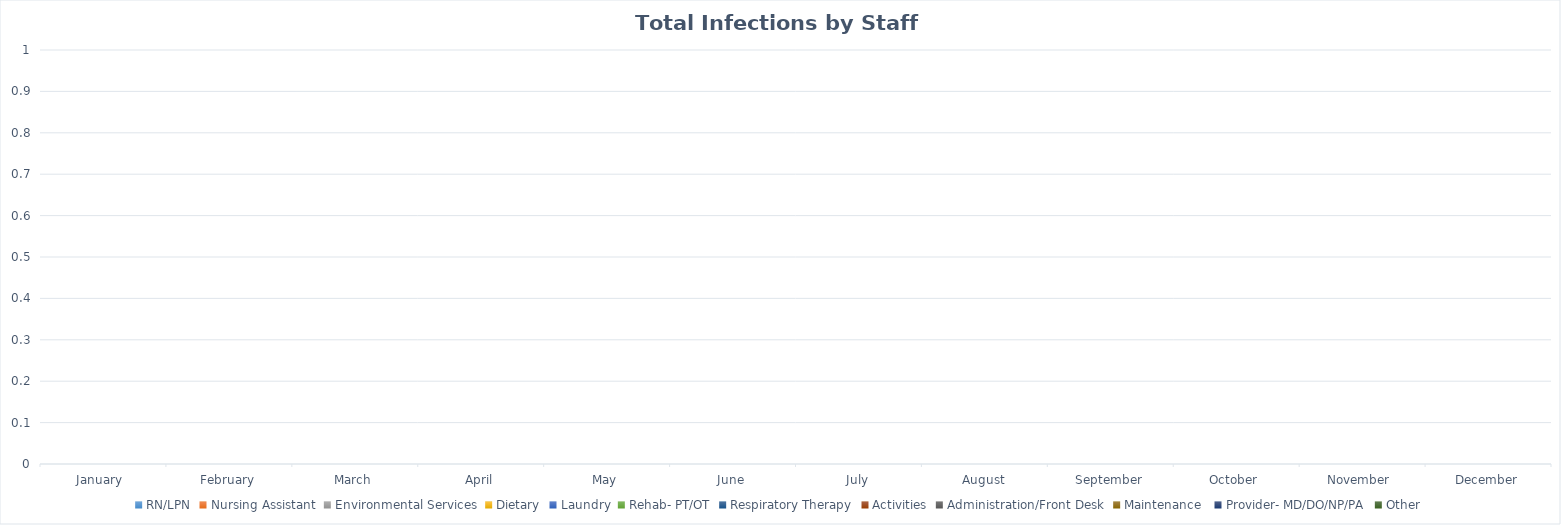
| Category | RN/LPN | Nursing Assistant | Environmental Services | Dietary | Laundry | Rehab- PT/OT | Respiratory Therapy | Activities | Administration/Front Desk | Maintenance  | Provider- MD/DO/NP/PA | Other |
|---|---|---|---|---|---|---|---|---|---|---|---|---|
| January  | 0 | 0 | 0 | 0 | 0 | 0 | 0 | 0 | 0 | 0 | 0 | 0 |
| February | 0 | 0 | 0 | 0 | 0 | 0 | 0 | 0 | 0 | 0 | 0 | 0 |
| March | 0 | 0 | 0 | 0 | 0 | 0 | 0 | 0 | 0 | 0 | 0 | 0 |
| April | 0 | 0 | 0 | 0 | 0 | 0 | 0 | 0 | 0 | 0 | 0 | 0 |
| May | 0 | 0 | 0 | 0 | 0 | 0 | 0 | 0 | 0 | 0 | 0 | 0 |
| June | 0 | 0 | 0 | 0 | 0 | 0 | 0 | 0 | 0 | 0 | 0 | 0 |
| July | 0 | 0 | 0 | 0 | 0 | 0 | 0 | 0 | 0 | 0 | 0 | 0 |
| August | 0 | 0 | 0 | 0 | 0 | 0 | 0 | 0 | 0 | 0 | 0 | 0 |
| September | 0 | 0 | 0 | 0 | 0 | 0 | 0 | 0 | 0 | 0 | 0 | 0 |
| October  | 0 | 0 | 0 | 0 | 0 | 0 | 0 | 0 | 0 | 0 | 0 | 0 |
| November  | 0 | 0 | 0 | 0 | 0 | 0 | 0 | 0 | 0 | 0 | 0 | 0 |
| December | 0 | 0 | 0 | 0 | 0 | 0 | 0 | 0 | 0 | 0 | 0 | 0 |